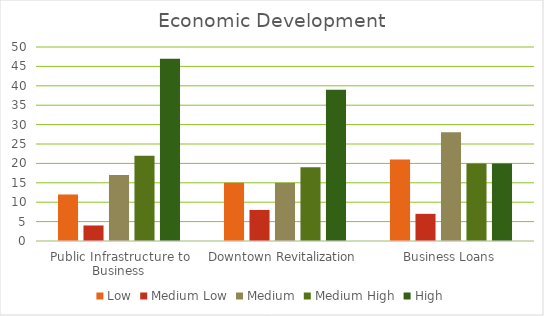
| Category | Low | Medium Low | Medium | Medium High | High |
|---|---|---|---|---|---|
| Public Infrastructure to Business | 12 | 4 | 17 | 22 | 47 |
| Downtown Revitalization | 15 | 8 | 15 | 19 | 39 |
| Business Loans | 21 | 7 | 28 | 20 | 20 |